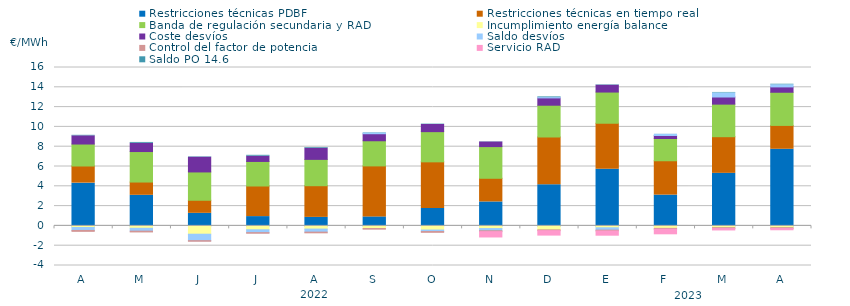
| Category | Restricciones técnicas PDBF | Restricciones técnicas en tiempo real | Banda de regulación secundaria y RAD | Incumplimiento energía balance | Coste desvíos | Saldo desvíos | Control del factor de potencia | Servicio RAD | Saldo PO 14.6 |
|---|---|---|---|---|---|---|---|---|---|
| A | 4.32 | 1.73 | 2.22 | -0.16 | 0.83 | -0.3 | -0.09 | 0 | 0.05 |
| M | 3.09 | 1.34 | 3.08 | -0.24 | 0.83 | -0.29 | -0.08 | 0 | 0.09 |
| J | 1.27 | 1.32 | 2.86 | -0.84 | 1.49 | -0.65 | -0.06 | 0 | 0.04 |
| J | 0.94 | 3.09 | 2.48 | -0.39 | 0.53 | -0.29 | -0.06 | 0 | 0.09 |
| A | 0.86 | 3.2 | 2.66 | -0.32 | 1.13 | -0.31 | -0.07 | 0 | 0.07 |
| S | 0.91 | 5.15 | 2.54 | -0.26 | 0.71 | 0.08 | -0.07 | 0 | 0.03 |
| O | 1.76 | 4.71 | 3.05 | -0.42 | 0.72 | -0.15 | -0.08 | 0 | 0.04 |
| N | 2.42 | 2.39 | 3.2 | -0.27 | 0.47 | -0.22 | -0.09 | -0.64 | 0.02 |
| D | 4.16 | 4.82 | 3.21 | -0.4 | 0.74 | 0.03 | -0.08 | -0.55 | 0.07 |
| E | 5.73 | 4.64 | 3.15 | -0.19 | 0.69 | -0.24 | -0.08 | -0.53 | 0.04 |
| F | 3.11 | 3.47 | 2.25 | -0.25 | 0.3 | 0.12 | -0.08 | -0.57 | 0.01 |
| M | 5.31 | 3.7 | 3.29 | -0.18 | 0.72 | 0.41 | -0.09 | -0.24 | 0.05 |
| A | 7.74 | 2.41 | 3.35 | -0.18 | 0.54 | 0.21 | -0.09 | -0.22 | 0.06 |